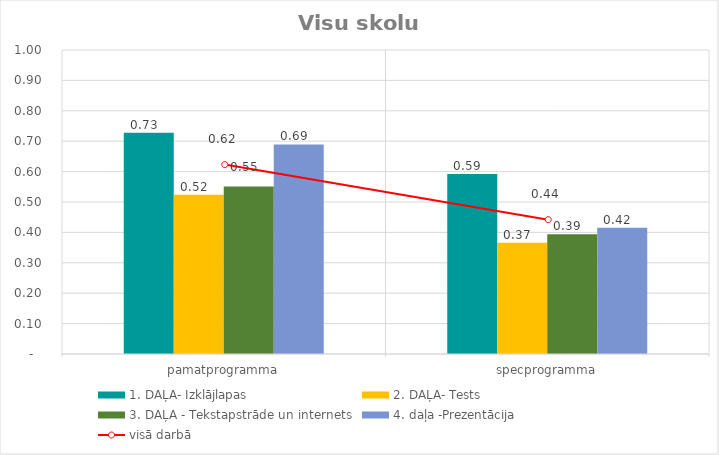
| Category | 1. DAĻA- Izklājlapas | 2. DAĻA- Tests | 3. DAĻA - Tekstapstrāde un internets | 4. daļa -Prezentācija |
|---|---|---|---|---|
| pamatprogramma | 0.728 | 0.524 | 0.551 | 0.689 |
| specprogramma | 0.592 | 0.366 | 0.394 | 0.415 |